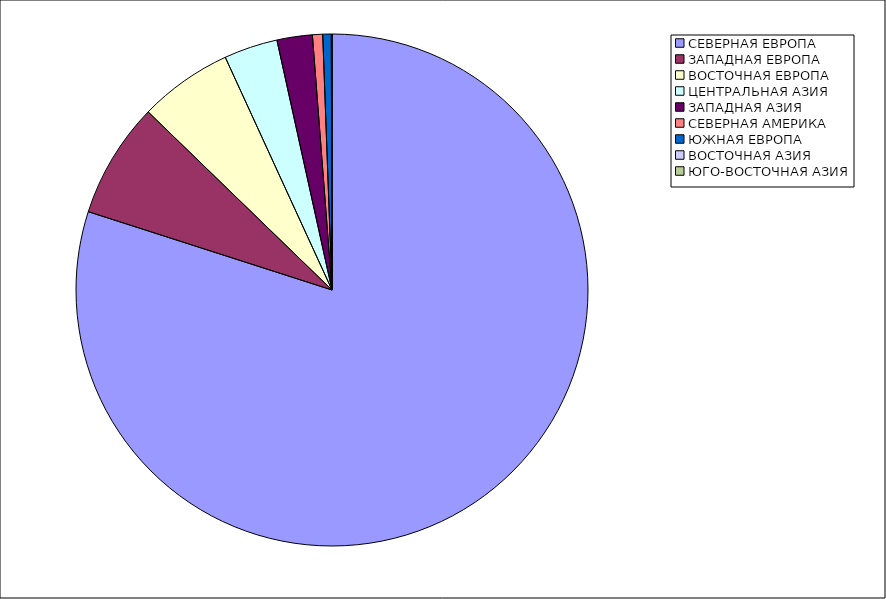
| Category | Оборот |
|---|---|
| СЕВЕРНАЯ ЕВРОПА | 79.947 |
| ЗАПАДНАЯ ЕВРОПА | 7.3 |
| ВОСТОЧНАЯ ЕВРОПА | 5.909 |
| ЦЕНТРАЛЬНАЯ АЗИЯ | 3.389 |
| ЗАПАДНАЯ АЗИЯ | 2.233 |
| СЕВЕРНАЯ АМЕРИКА | 0.645 |
| ЮЖНАЯ ЕВРОПА | 0.534 |
| ВОСТОЧНАЯ АЗИЯ | 0.043 |
| ЮГО-ВОСТОЧНАЯ АЗИЯ | 0 |